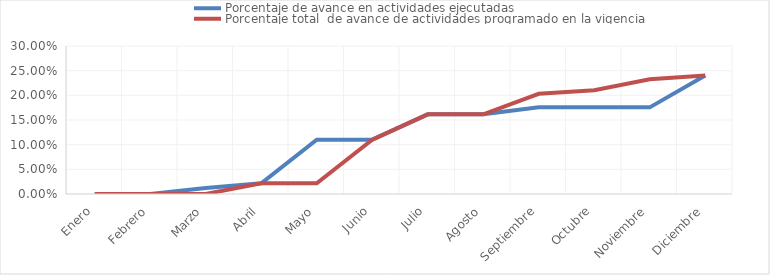
| Category | Porcentaje de avance en actividades ejecutadas | Porcentaje total  de avance de actividades programado en la vigencia |
|---|---|---|
| 0 | 0 | 0 |
| 1 | 0 | 0 |
| 2 | 0.012 | 0 |
| 3 | 0.022 | 0.022 |
| 4 | 0.11 | 0.022 |
| 5 | 0.11 | 0.11 |
| 6 | 0.162 | 0.162 |
| 7 | 0.162 | 0.162 |
| 8 | 0.176 | 0.203 |
| 9 | 0.176 | 0.21 |
| 10 | 0.176 | 0.232 |
| 11 | 0.24 | 0.24 |